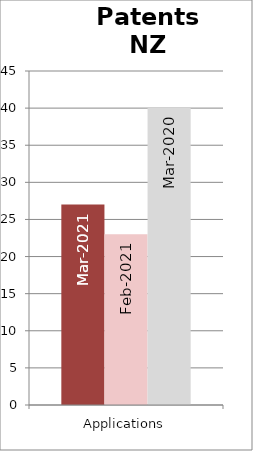
| Category | Mar-2021 | Feb-2021 | Mar-2020 |
|---|---|---|---|
| Applications | 27 | 23 | 40 |